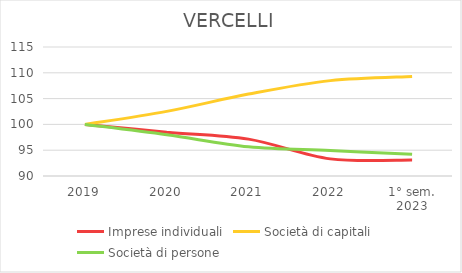
| Category | Imprese individuali | Società di capitali | Società di persone |
|---|---|---|---|
| 2019 | 100 | 100 | 100 |
| 2020 | 98.493 | 102.529 | 97.994 |
| 2021 | 97.146 | 105.873 | 95.654 |
| 2022 | 93.318 | 108.483 | 94.938 |
| 1° sem.
2023 | 93.105 | 109.299 | 94.222 |